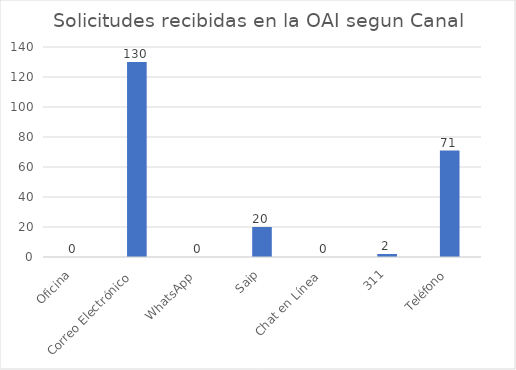
| Category | Series 0 |
|---|---|
| Oficina | 0 |
| Correo Electrónico  | 130 |
| WhatsApp  | 0 |
| Saip | 20 |
| Chat en Línea  | 0 |
| 311 | 2 |
| Teléfono | 71 |